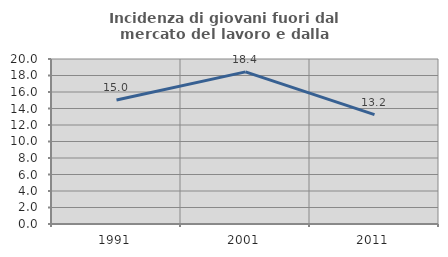
| Category | Incidenza di giovani fuori dal mercato del lavoro e dalla formazione  |
|---|---|
| 1991.0 | 15.04 |
| 2001.0 | 18.437 |
| 2011.0 | 13.249 |